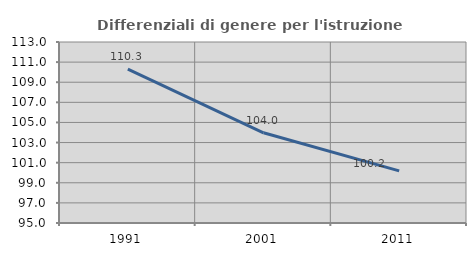
| Category | Differenziali di genere per l'istruzione superiore |
|---|---|
| 1991.0 | 110.307 |
| 2001.0 | 103.973 |
| 2011.0 | 100.183 |